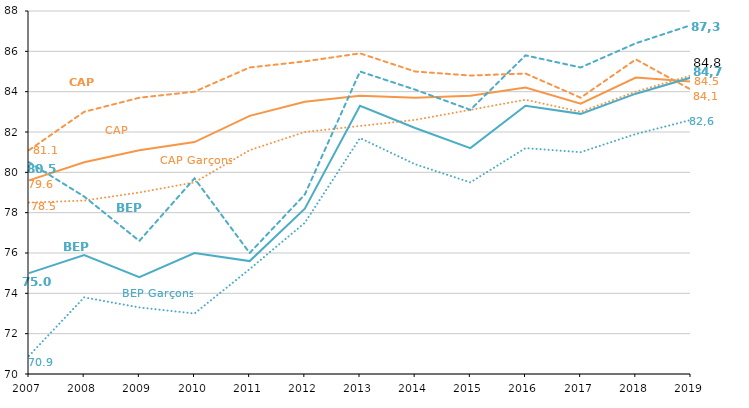
| Category | CAP Garçons | CAP Filles | CAP | BEP Garçons | BEP Filles | BEP |
|---|---|---|---|---|---|---|
| 2007.0 | 78.5 | 81.1 | 79.6 | 70.9 | 80.5 | 75 |
| 2008.0 | 78.6 | 83 | 80.5 | 73.8 | 78.8 | 75.9 |
| 2009.0 | 79 | 83.7 | 81.1 | 73.3 | 76.6 | 74.8 |
| 2010.0 | 79.5 | 84 | 81.5 | 73 | 79.7 | 76 |
| 2011.0 | 81.1 | 85.2 | 82.8 | 75.2 | 76 | 75.6 |
| 2012.0 | 82 | 85.5 | 83.5 | 77.5 | 78.9 | 78.2 |
| 2013.0 | 82.3 | 85.9 | 83.8 | 81.7 | 85 | 83.3 |
| 2014.0 | 82.6 | 85 | 83.7 | 80.4 | 84.1 | 82.2 |
| 2015.0 | 83.1 | 84.8 | 83.8 | 79.5 | 83.1 | 81.2 |
| 2016.0 | 83.6 | 84.9 | 84.2 | 81.2 | 85.8 | 83.3 |
| 2017.0 | 83 | 83.7 | 83.4 | 81 | 85.2 | 82.9 |
| 2018.0 | 84 | 85.6 | 84.7 | 81.9 | 86.4 | 83.9 |
| 2019.0 | 84.8 | 84.1 | 84.5 | 82.6 | 87.3 | 84.7 |